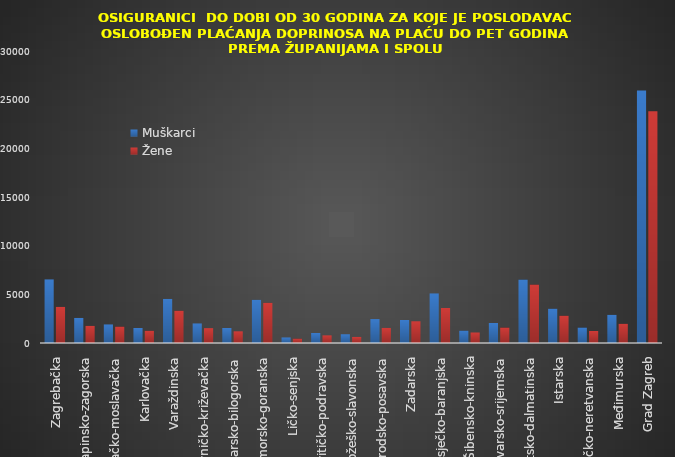
| Category | Muškarci | Žene |
|---|---|---|
| Zagrebačka | 6532 | 3708 |
| Krapinsko-zagorska | 2573 | 1757 |
| Sisačko-moslavačka | 1906 | 1686 |
| Karlovačka | 1541 | 1256 |
| Varaždinska | 4527 | 3315 |
| Koprivničko-križevačka | 2008 | 1525 |
| Bjelovarsko-bilogorska | 1543 | 1200 |
| Primorsko-goranska | 4436 | 4130 |
| Ličko-senjska | 569 | 451 |
| Virovitičko-podravska | 1029 | 784 |
| Požeško-slavonska | 900 | 624 |
| Brodsko-posavska | 2459 | 1550 |
| Zadarska | 2365 | 2232 |
| Osječko-baranjska | 5091 | 3599 |
| Šibensko-kninska | 1272 | 1079 |
| Vukovarsko-srijemska | 2054 | 1589 |
| Splitsko-dalmatinska | 6521 | 6004 |
| Istarska | 3523 | 2801 |
| Dubrovačko-neretvanska | 1589 | 1236 |
| Međimurska | 2892 | 1971 |
| Grad Zagreb | 25947 | 23815 |